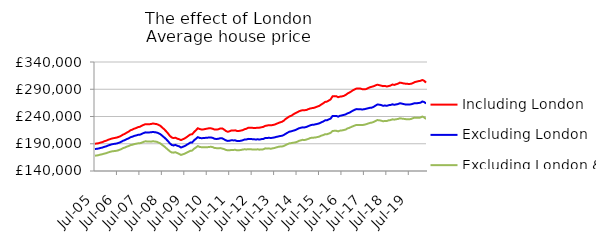
| Category | Including London | Excluding London | Excluding London & SE |
|---|---|---|---|
| 2005-07-01 | 190099.846 | 180338.943 | 168115.943 |
| 2005-08-01 | 190409.416 | 180707.116 | 168387.745 |
| 2005-09-01 | 191025.705 | 181294.079 | 169165.237 |
| 2005-10-01 | 192128.229 | 182260.003 | 170136.846 |
| 2005-11-01 | 193022.749 | 183020.557 | 170802.395 |
| 2005-12-01 | 194589.472 | 184321.051 | 171890.78 |
| 2006-01-01 | 195561.889 | 185223.855 | 172601.05 |
| 2006-02-01 | 197180.233 | 186694.526 | 173973.307 |
| 2006-03-01 | 198290.018 | 187883.534 | 175074.67 |
| 2006-04-01 | 199521.21 | 188954.872 | 175987.174 |
| 2006-05-01 | 200291.878 | 189620.06 | 176437.969 |
| 2006-06-01 | 200874.24 | 190048.53 | 176847.591 |
| 2006-07-01 | 201753.772 | 190830.896 | 177451.803 |
| 2006-08-01 | 202945.476 | 191932.237 | 178625.067 |
| 2006-09-01 | 204665.909 | 193486.107 | 180029.257 |
| 2006-10-01 | 206669.853 | 195431.198 | 181917.714 |
| 2006-11-01 | 208271.992 | 196704.296 | 182996.889 |
| 2006-12-01 | 210431.706 | 198484.218 | 184628.33 |
| 2007-01-01 | 212236.573 | 199867.99 | 185753.039 |
| 2007-02-01 | 214691.924 | 201953.448 | 187491.53 |
| 2007-03-01 | 215960.598 | 202950.014 | 188129.855 |
| 2007-04-01 | 217668.208 | 204390.327 | 189305.612 |
| 2007-05-01 | 218745.526 | 205176.529 | 190051.523 |
| 2007-06-01 | 220436.757 | 206350.676 | 190766.928 |
| 2007-07-01 | 221128.98 | 206601.586 | 190934.336 |
| 2007-08-01 | 222903.284 | 208023.687 | 191970.933 |
| 2007-09-01 | 224639.27 | 209648.69 | 193488.751 |
| 2007-10-01 | 225909.983 | 210886.574 | 194554.085 |
| 2007-11-01 | 225637.65 | 210701.658 | 194139.319 |
| 2007-12-01 | 225795.991 | 210808.016 | 194100.151 |
| 2008-01-01 | 226230.744 | 210997.948 | 193849.067 |
| 2008-02-01 | 227150.677 | 211685.752 | 194629.825 |
| 2008-03-01 | 226536.237 | 211131.036 | 194027.854 |
| 2008-04-01 | 226088.749 | 210687.499 | 193735.581 |
| 2008-05-01 | 224583.894 | 209243.33 | 192031.653 |
| 2008-06-01 | 222870.934 | 207605.676 | 190599.84 |
| 2008-07-01 | 219624.904 | 204552.197 | 187738.181 |
| 2008-08-01 | 216697.269 | 201783.679 | 185273.991 |
| 2008-09-01 | 213087.292 | 198550.708 | 182220.184 |
| 2008-10-01 | 209193.305 | 194954.131 | 179292.765 |
| 2008-11-01 | 204692.274 | 190946.059 | 176189.96 |
| 2008-12-01 | 201599.231 | 187849.92 | 174117.242 |
| 2009-01-01 | 200403.32 | 186878.072 | 173689.928 |
| 2009-02-01 | 201116.809 | 187902.199 | 174505.275 |
| 2009-03-01 | 199383.582 | 186328.236 | 172948.571 |
| 2009-04-01 | 198315.606 | 185259.882 | 171374.665 |
| 2009-05-01 | 196756.715 | 183093.397 | 169466.686 |
| 2009-06-01 | 198255.489 | 184493.743 | 170575.472 |
| 2009-07-01 | 199781.16 | 185725.435 | 171866.354 |
| 2009-08-01 | 202057.625 | 187894.019 | 173683.287 |
| 2009-09-01 | 204651.712 | 189897.228 | 175272.485 |
| 2009-10-01 | 206995.738 | 192147.604 | 177124.978 |
| 2009-11-01 | 207417.779 | 192401.732 | 177434.262 |
| 2009-12-01 | 211553.202 | 196348.095 | 180850.865 |
| 2010-01-01 | 214802.067 | 199095.743 | 183197.337 |
| 2010-02-01 | 218402.314 | 202123.005 | 185706.212 |
| 2010-03-01 | 216980.15 | 200671.83 | 184170.446 |
| 2010-04-01 | 216236.552 | 200161.69 | 183628.078 |
| 2010-05-01 | 216342.245 | 200449.238 | 183492.691 |
| 2010-06-01 | 217108.95 | 200783.748 | 183659.372 |
| 2010-07-01 | 217722.397 | 201016.807 | 183577.266 |
| 2010-08-01 | 218424.805 | 201510.881 | 184095.582 |
| 2010-09-01 | 218322.566 | 201613.716 | 184429.571 |
| 2010-10-01 | 217469.066 | 200750.626 | 183714.847 |
| 2010-11-01 | 215945.135 | 199049.754 | 182199.609 |
| 2010-12-01 | 216018.582 | 198791.843 | 181915.72 |
| 2011-01-01 | 216546.568 | 199114.513 | 181707.335 |
| 2011-02-01 | 218068.153 | 200152.075 | 182069.043 |
| 2011-03-01 | 218196.649 | 199966.213 | 181215.956 |
| 2011-04-01 | 216131.402 | 198173.837 | 180210.582 |
| 2011-05-01 | 213449.47 | 196231.995 | 178717.115 |
| 2011-06-01 | 211977.123 | 195154.451 | 177946.276 |
| 2011-07-01 | 212947.067 | 195568.747 | 178041.865 |
| 2011-08-01 | 214410.19 | 196445.281 | 178684.615 |
| 2011-09-01 | 214360.747 | 196165.982 | 178661.749 |
| 2011-10-01 | 214614.218 | 196213.259 | 178936.575 |
| 2011-11-01 | 213368.423 | 194966.866 | 177953.868 |
| 2011-12-01 | 213453.491 | 194865.197 | 178125.881 |
| 2012-01-01 | 214164.256 | 195514.42 | 178545.093 |
| 2012-02-01 | 214959.421 | 196404.975 | 179356.541 |
| 2012-03-01 | 216756.933 | 197817.955 | 179833.607 |
| 2012-04-01 | 217525.251 | 197898.314 | 179527.6 |
| 2012-05-01 | 219534.588 | 198949.536 | 180120.689 |
| 2012-06-01 | 219513.993 | 198774.052 | 180105.596 |
| 2012-07-01 | 219293.182 | 198462.317 | 179541.287 |
| 2012-08-01 | 218806.749 | 198165.774 | 179441.589 |
| 2012-09-01 | 219040.471 | 197834.003 | 179242.398 |
| 2012-10-01 | 219439.904 | 198189.625 | 179878.203 |
| 2012-11-01 | 219547.943 | 197705.403 | 179149.824 |
| 2012-12-01 | 220234.493 | 198496.975 | 179579.951 |
| 2013-01-01 | 220907.865 | 198670.322 | 179702.72 |
| 2013-02-01 | 222701.635 | 200446.331 | 181549.7 |
| 2013-03-01 | 223469.687 | 200554.563 | 181214.051 |
| 2013-04-01 | 224076.303 | 200944.861 | 181537.119 |
| 2013-05-01 | 223921.625 | 200574.706 | 180786.657 |
| 2013-06-01 | 224267.124 | 200953.441 | 181634.225 |
| 2013-07-01 | 225135.999 | 201680.442 | 182212.686 |
| 2013-08-01 | 226546.907 | 202586.569 | 183374.231 |
| 2013-09-01 | 227936.906 | 203391.678 | 184304.363 |
| 2013-10-01 | 229322.843 | 204234.069 | 184859.274 |
| 2013-11-01 | 230315.56 | 204602.914 | 184983.348 |
| 2013-12-01 | 232460.97 | 206225.51 | 185922.887 |
| 2014-01-01 | 235647.935 | 208367.783 | 187801.311 |
| 2014-02-01 | 237927.871 | 210397.831 | 189383.724 |
| 2014-03-01 | 240195.48 | 212153.651 | 190765.188 |
| 2014-04-01 | 241469.41 | 212884.813 | 191208.257 |
| 2014-05-01 | 243828.789 | 214011.28 | 191911.354 |
| 2014-06-01 | 245878.968 | 214988.938 | 192449.329 |
| 2014-07-01 | 247539.081 | 216525.132 | 193508.231 |
| 2014-08-01 | 249418.581 | 218299.792 | 195238.949 |
| 2014-09-01 | 250747.668 | 219267.162 | 196217.978 |
| 2014-10-01 | 251554.885 | 220056.663 | 197190.317 |
| 2014-11-01 | 251534.53 | 220011.241 | 196854.96 |
| 2014-12-01 | 251925.861 | 220856.382 | 197709.619 |
| 2015-01-01 | 253431.809 | 222218.445 | 198798.752 |
| 2015-02-01 | 254648.094 | 223740.73 | 200411.959 |
| 2015-03-01 | 255340.043 | 224687.291 | 201074.597 |
| 2015-04-01 | 255876.646 | 224953.264 | 201223.329 |
| 2015-05-01 | 257025.996 | 225743.668 | 201647.303 |
| 2015-06-01 | 258406.622 | 226541.496 | 202357.934 |
| 2015-07-01 | 259602.635 | 227594.255 | 203220.157 |
| 2015-08-01 | 262060.066 | 229279.729 | 204864.029 |
| 2015-09-01 | 264071.331 | 230781.509 | 205875.688 |
| 2015-10-01 | 266782.334 | 232880.229 | 207519.819 |
| 2015-11-01 | 267291.861 | 233078.556 | 207401.625 |
| 2015-12-01 | 269274.759 | 234653.062 | 208682.249 |
| 2016-01-01 | 271443.4 | 236250.053 | 209960.366 |
| 2016-02-01 | 277004.369 | 240964.363 | 213565.188 |
| 2016-03-01 | 277389.465 | 241069.016 | 213647.835 |
| 2016-04-01 | 277297.091 | 241113.692 | 213747.829 |
| 2016-05-01 | 275418.62 | 239697.966 | 212715.74 |
| 2016-06-01 | 276421.502 | 241310.921 | 214050.192 |
| 2016-07-01 | 276889.319 | 242056.992 | 214467.794 |
| 2016-08-01 | 277720.279 | 242891.392 | 215117.975 |
| 2016-09-01 | 279478.836 | 243807.73 | 215967.563 |
| 2016-10-01 | 282129.038 | 245841.601 | 218145.007 |
| 2016-11-01 | 283867.789 | 246937.83 | 219176.651 |
| 2016-12-01 | 285994.373 | 248943.025 | 220801.556 |
| 2017-01-01 | 288305.174 | 250939.187 | 222234.01 |
| 2017-02-01 | 290047.786 | 252664.53 | 223665.666 |
| 2017-03-01 | 291500.755 | 253648.484 | 224617.928 |
| 2017-04-01 | 291264.163 | 253147.959 | 224186.554 |
| 2017-05-01 | 291153.386 | 253193.423 | 224375.022 |
| 2017-06-01 | 290026.535 | 252897.924 | 224334.818 |
| 2017-07-01 | 289885.181 | 253387.675 | 224923.239 |
| 2017-08-01 | 290351.528 | 254209.469 | 225867.267 |
| 2017-09-01 | 292184.806 | 255170.845 | 227087.971 |
| 2017-10-01 | 293542.539 | 255913.818 | 228216.141 |
| 2017-11-01 | 294658.844 | 256267.421 | 228814.007 |
| 2017-12-01 | 295560.962 | 257834.073 | 230059.837 |
| 2018-01-01 | 297174.388 | 260013.605 | 231751.663 |
| 2018-02-01 | 298313.44 | 262036.077 | 233468.14 |
| 2018-03-01 | 297460.703 | 261701.24 | 233051.072 |
| 2018-04-01 | 296660.349 | 261063.081 | 232359.108 |
| 2018-05-01 | 295704.696 | 259681.755 | 231217.99 |
| 2018-06-01 | 296136.927 | 260172.462 | 231919.124 |
| 2018-07-01 | 295042.264 | 259596.91 | 231731.04 |
| 2018-08-01 | 295883.669 | 260772.254 | 232991.887 |
| 2018-09-01 | 296762.15 | 261122.803 | 233452.043 |
| 2018-10-01 | 298734.437 | 262365.668 | 234840.094 |
| 2018-11-01 | 297922.604 | 261492.642 | 234166.854 |
| 2018-12-01 | 299160.392 | 262164.977 | 235005.003 |
| 2019-01-01 | 300261.68 | 262839.893 | 235365.107 |
| 2019-02-01 | 302165.974 | 264306.736 | 236726.516 |
| 2019-03-01 | 301573.914 | 263685.195 | 236153.164 |
| 2019-04-01 | 300702.73 | 262802.196 | 235744.994 |
| 2019-05-01 | 300230.383 | 262137.777 | 235212.27 |
| 2019-06-01 | 299918.354 | 261993.3 | 234853.579 |
| 2019-07-01 | 299708.451 | 261980.64 | 234920.048 |
| 2019-08-01 | 299972.915 | 262353.406 | 235487.742 |
| 2019-09-01 | 301428.382 | 263448.442 | 236962.79 |
| 2019-10-01 | 303128.67 | 264493.478 | 237962.589 |
| 2019-11-01 | 304058.674 | 264380.791 | 237624.874 |
| 2019-12-01 | 304910.581 | 264690.849 | 237691.912 |
| 2020-01-01 | 305473.884 | 265323.67 | 238002.866 |
| 2020-02-01 | 306975.619 | 267550.095 | 239970.351 |
| 2020-03-01 | 305470.264 | 266449.834 | 238171.642 |
| 2020-04-01 | 302074.476 | 263827.395 | 235429.242 |